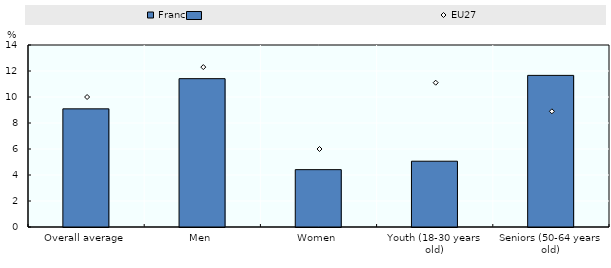
| Category | France |
|---|---|
| Overall average | 9.089 |
| Men | 11.41 |
| Women | 4.412 |
| Youth (18-30 years old) | 5.061 |
| Seniors (50-64 years old) | 11.663 |